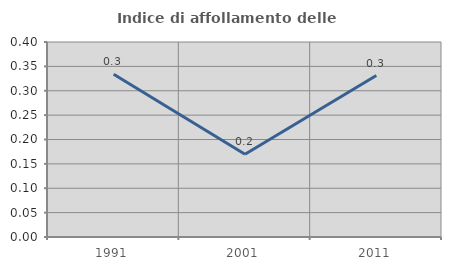
| Category | Indice di affollamento delle abitazioni  |
|---|---|
| 1991.0 | 0.334 |
| 2001.0 | 0.17 |
| 2011.0 | 0.331 |